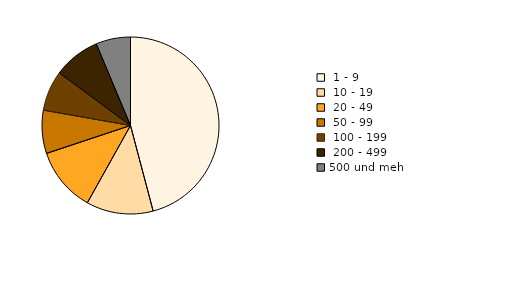
| Category | Series 0 |
|---|---|
|  1 - 9 | 1798 |
|  10 - 19 | 479 |
|  20 - 49 | 462 |
|  50 - 99 | 309 |
|  100 - 199 | 288 |
|  200 - 499 | 335 |
| 500 und mehr | 248 |